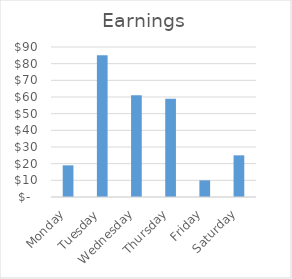
| Category | Earnings |
|---|---|
| Monday | 19 |
| Tuesday | 85 |
| Wednesday | 61 |
| Thursday | 59 |
| Friday | 10 |
| Saturday | 25 |